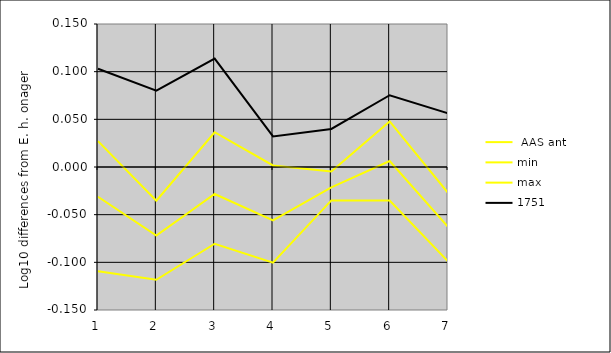
| Category |  AAS ant | min | max | 1751 |
|---|---|---|---|---|
| 1.0 | -0.031 | -0.109 | 0.027 | 0.103 |
| 2.0 | -0.072 | -0.118 | -0.035 | 0.08 |
| 3.0 | -0.028 | -0.08 | 0.036 | 0.114 |
| 4.0 | -0.056 | -0.1 | 0.002 | 0.032 |
| 5.0 | -0.021 | -0.035 | -0.005 | 0.04 |
| 6.0 | 0.006 | -0.035 | 0.048 | 0.075 |
| 7.0 | -0.063 | -0.099 | -0.027 | 0.056 |